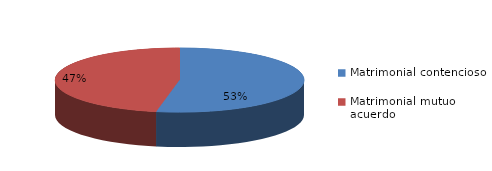
| Category | Series 0 |
|---|---|
| 0 | 825 |
| 1 | 732 |